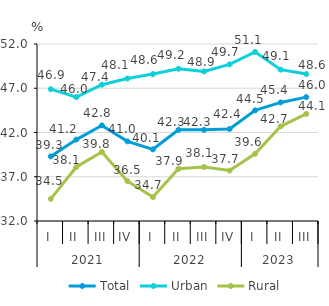
| Category | Total | Urban | Rural |
|---|---|---|---|
| 0 | 39.3 | 46.9 | 34.5 |
| 1 | 41.2 | 46 | 38.1 |
| 2 | 42.8 | 47.4 | 39.8 |
| 3 | 41 | 48.1 | 36.5 |
| 4 | 40.1 | 48.6 | 34.7 |
| 5 | 42.3 | 49.2 | 37.9 |
| 6 | 42.3 | 48.9 | 38.1 |
| 7 | 42.4 | 49.7 | 37.7 |
| 8 | 44.5 | 51.1 | 39.6 |
| 9 | 45.4 | 49.1 | 42.7 |
| 10 | 46 | 48.6 | 44.1 |